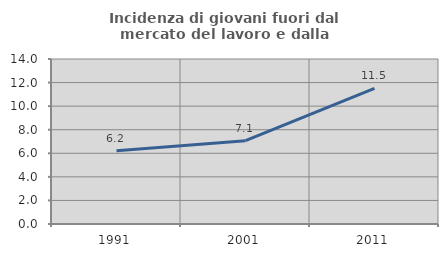
| Category | Incidenza di giovani fuori dal mercato del lavoro e dalla formazione  |
|---|---|
| 1991.0 | 6.209 |
| 2001.0 | 7.074 |
| 2011.0 | 11.511 |